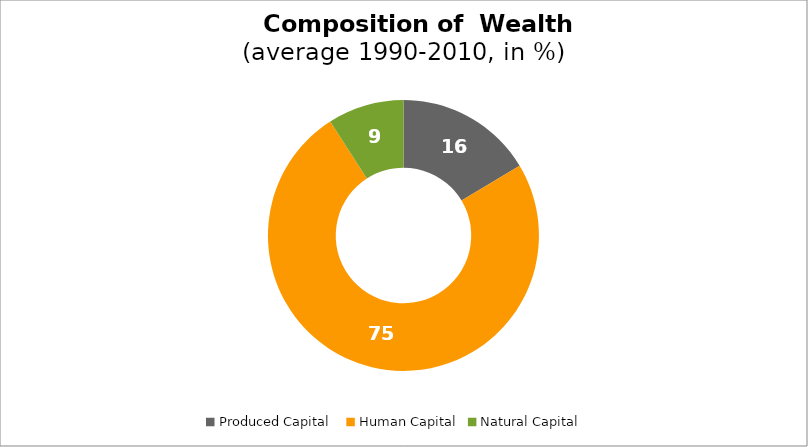
| Category | Series 0 |
|---|---|
| Produced Capital  | 16.378 |
| Human Capital | 74.533 |
| Natural Capital | 9.09 |